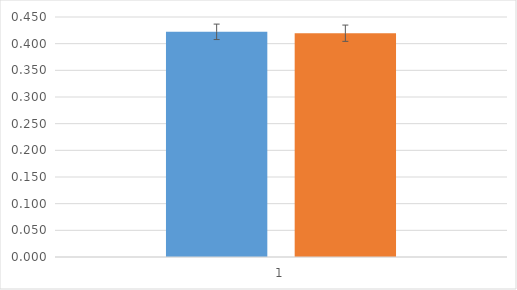
| Category | control | PKD3tg |
|---|---|---|
| 0 | 0.422 | 0.42 |